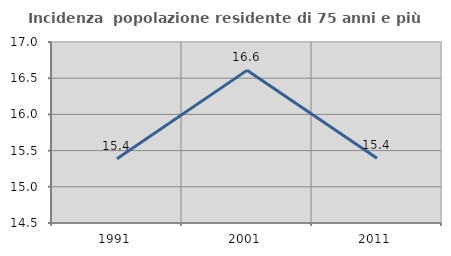
| Category | Incidenza  popolazione residente di 75 anni e più |
|---|---|
| 1991.0 | 15.388 |
| 2001.0 | 16.608 |
| 2011.0 | 15.394 |